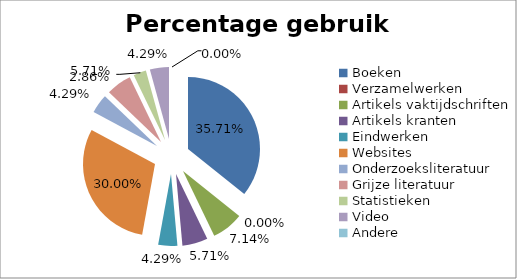
| Category | Series 0 |
|---|---|
| Boeken | 0.357 |
| Verzamelwerken | 0 |
| Artikels vaktijdschriften | 0.071 |
| Artikels kranten | 0.057 |
| Eindwerken | 0.043 |
| Websites | 0.3 |
| Onderzoeksliteratuur | 0.043 |
| Grijze literatuur | 0.057 |
| Statistieken | 0.029 |
| Video | 0.043 |
| Andere | 0 |